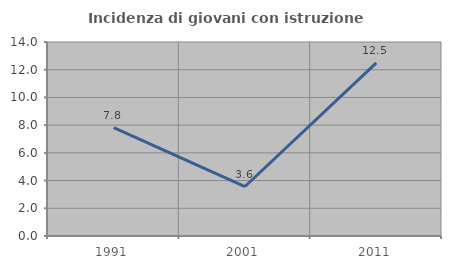
| Category | Incidenza di giovani con istruzione universitaria |
|---|---|
| 1991.0 | 7.812 |
| 2001.0 | 3.571 |
| 2011.0 | 12.5 |